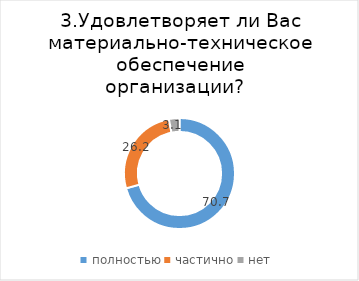
| Category | Series 0 |
|---|---|
| полностью | 70.69 |
| частично | 26.245 |
| нет | 3.065 |